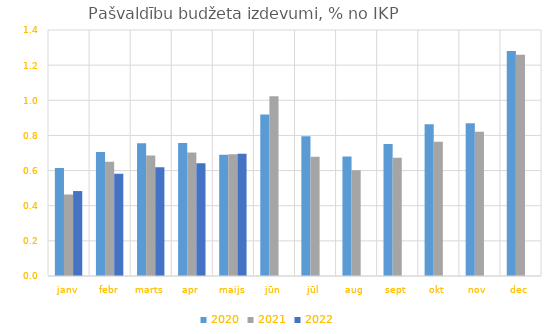
| Category | 2020 | 2021 | 2022 |
|---|---|---|---|
| janv | 0.614 | 0.464 | 0.483 |
| febr | 0.706 | 0.65 | 0.581 |
| marts | 0.756 | 0.685 | 0.619 |
| apr | 0.758 | 0.702 | 0.641 |
| maijs | 0.69 | 0.693 | 0.695 |
| jūn | 0.919 | 1.022 | 0 |
| jūl | 0.795 | 0.678 | 0 |
| aug | 0.68 | 0.601 | 0 |
| sept | 0.751 | 0.674 | 0 |
| okt | 0.864 | 0.765 | 0 |
| nov | 0.87 | 0.82 | 0 |
| dec | 1.281 | 1.258 | 0 |